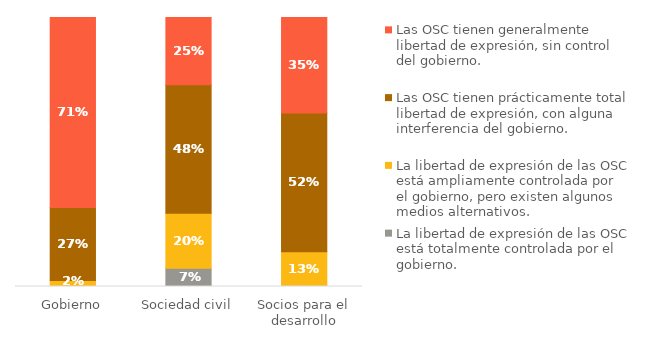
| Category | La libertad de expresión de las OSC está totalmente controlada por el gobierno. | La libertad de expresión de las OSC está ampliamente controlada por el gobierno, pero existen algunos medios alternativos. | Las OSC tienen prácticamente total libertad de expresión, con alguna interferencia del gobierno. | Las OSC tienen generalmente libertad de expresión, sin control del gobierno. |
|---|---|---|---|---|
| Gobierno | 0 | 0.023 | 0.273 | 0.71 |
| Sociedad civil | 0.068 | 0.205 | 0.477 | 0.25 |
| Socios para el desarrollo | 0 | 0.129 | 0.516 | 0.355 |